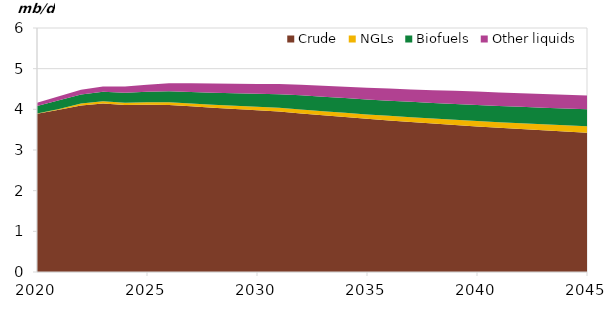
| Category | Crude | NGLs | Biofuels | Other liquids |
|---|---|---|---|---|
| 2020-01-01 | 3.889 | 0.006 | 0.188 | 0.078 |
| 2021-01-01 | 3.988 | 0.02 | 0.218 | 0.094 |
| 2022-01-01 | 4.094 | 0.052 | 0.221 | 0.112 |
| 2023-01-01 | 4.143 | 0.056 | 0.231 | 0.133 |
| 2024-01-01 | 4.104 | 0.061 | 0.242 | 0.153 |
| 2025-01-01 | 4.111 | 0.064 | 0.257 | 0.174 |
| 2026-01-01 | 4.108 | 0.068 | 0.27 | 0.195 |
| 2027-01-01 | 4.073 | 0.072 | 0.282 | 0.216 |
| 2028-01-01 | 4.039 | 0.076 | 0.294 | 0.225 |
| 2029-01-01 | 4.007 | 0.079 | 0.307 | 0.234 |
| 2030-01-01 | 3.976 | 0.084 | 0.322 | 0.243 |
| 2031-01-01 | 3.947 | 0.089 | 0.338 | 0.252 |
| 2032-01-01 | 3.899 | 0.094 | 0.353 | 0.261 |
| 2033-01-01 | 3.853 | 0.099 | 0.358 | 0.27 |
| 2034-01-01 | 3.809 | 0.104 | 0.363 | 0.279 |
| 2035-01-01 | 3.767 | 0.109 | 0.368 | 0.288 |
| 2036-01-01 | 3.726 | 0.114 | 0.373 | 0.297 |
| 2037-01-01 | 3.687 | 0.119 | 0.378 | 0.306 |
| 2038-01-01 | 3.65 | 0.124 | 0.383 | 0.315 |
| 2039-01-01 | 3.614 | 0.129 | 0.388 | 0.324 |
| 2040-01-01 | 3.579 | 0.134 | 0.393 | 0.333 |
| 2041-01-01 | 3.546 | 0.138 | 0.398 | 0.334 |
| 2042-01-01 | 3.514 | 0.143 | 0.403 | 0.335 |
| 2043-01-01 | 3.484 | 0.148 | 0.408 | 0.336 |
| 2044-01-01 | 3.454 | 0.153 | 0.413 | 0.337 |
| 2045-01-01 | 3.426 | 0.158 | 0.418 | 0.338 |